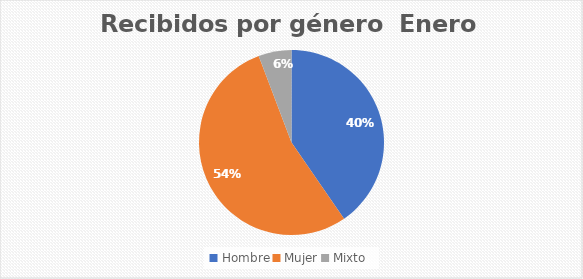
| Category | Recibidos por género  Enero |
|---|---|
| Hombre | 21 |
| Mujer | 28 |
| Mixto | 3 |